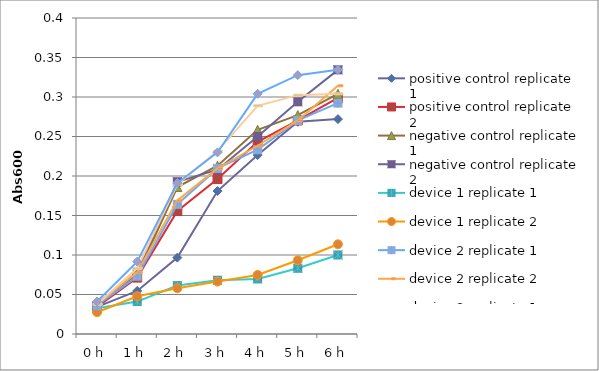
| Category | positive control | negative control | device 1 | device 2 | device 3 |
|---|---|---|---|---|---|
| 0 h | 0.034 | 0.036 | 0.028 | 0.038 | 0.041 |
| 1 h | 0.071 | 0.078 | 0.048 | 0.078 | 0.092 |
| 2 h | 0.156 | 0.193 | 0.058 | 0.169 | 0.191 |
| 3 h | 0.196 | 0.208 | 0.066 | 0.21 | 0.23 |
| 4 h | 0.243 | 0.25 | 0.075 | 0.238 | 0.304 |
| 5 h | 0.27 | 0.294 | 0.093 | 0.27 | 0.328 |
| 6 h | 0.299 | 0.334 | 0.114 | 0.314 | 0.334 |